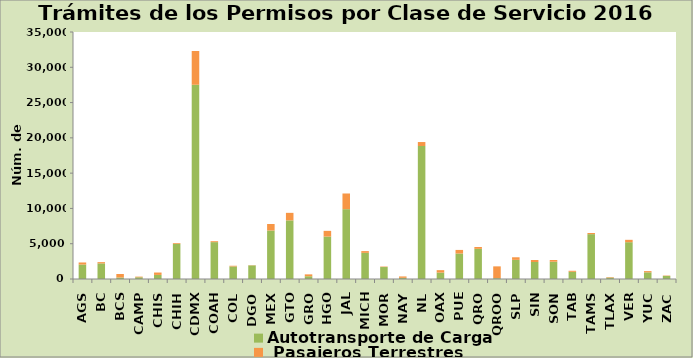
| Category | Autotransporte de Carga  |  Pasajeros Terrestres |
|---|---|---|
| AGS | 2046 | 296 |
| BC | 2211 | 178 |
| BCS | 212 | 497 |
| CAMP | 247 | 89 |
| CHIS | 580 | 337 |
| CHIH | 4984 | 108 |
| CDMX | 27523 | 4788 |
| COAH | 5225 | 130 |
| COL | 1777 | 99 |
| DGO | 1928 | 31 |
| MEX | 6869 | 923 |
| GTO | 8308 | 1066 |
| GRO | 388 | 268 |
| HGO | 6010 | 812 |
| JAL | 9895 | 2222 |
| MICH | 3706 | 247 |
| MOR | 1696 | 66 |
| NAY | 163 | 199 |
| NL | 18844 | 564 |
| OAX | 909 | 345 |
| PUE | 3609 | 510 |
| QRO | 4272 | 265 |
| QROO | 118 | 1672 |
| SLP | 2712 | 366 |
| SIN | 2412 | 281 |
| SON | 2448 | 244 |
| TAB | 1018 | 147 |
| TAMS | 6355 | 161 |
| TLAX | 201 | 67 |
| VER | 5216 | 335 |
| YUC | 943 | 174 |
| ZAC | 437 | 51 |